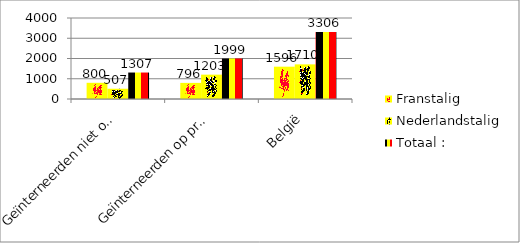
| Category | Franstalig | Nederlandstalig | Totaal :  |
|---|---|---|---|
| Geïnterneerden niet op proef | 800 | 507 | 1307 |
| Geïnterneerden op proef | 796 | 1203 | 1999 |
| België | 1596 | 1710 | 3306 |